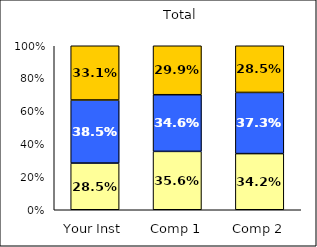
| Category | Low Science Self-Efficacy | Average Science Self-Efficacy | High Science Self-Efficacy |
|---|---|---|---|
| Your Inst | 0.285 | 0.385 | 0.331 |
| Comp 1 | 0.356 | 0.346 | 0.299 |
| Comp 2 | 0.342 | 0.373 | 0.285 |